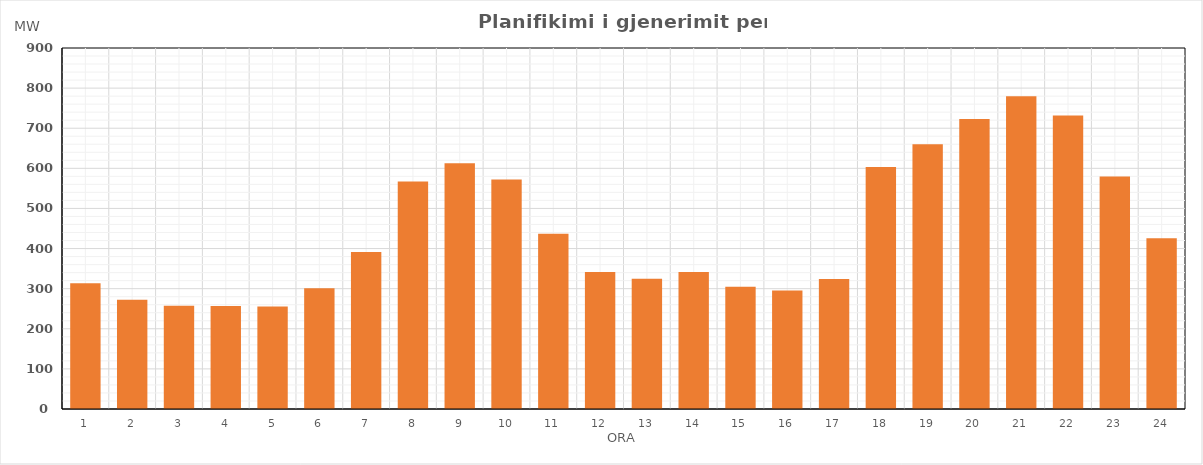
| Category | Max (MW) |
|---|---|
| 0 | 313.65 |
| 1 | 272.61 |
| 2 | 257.57 |
| 3 | 256.58 |
| 4 | 255.6 |
| 5 | 301.27 |
| 6 | 391.26 |
| 7 | 567.4 |
| 8 | 612.75 |
| 9 | 571.9 |
| 10 | 436.67 |
| 11 | 341.71 |
| 12 | 324.69 |
| 13 | 341.77 |
| 14 | 304.64 |
| 15 | 295.54 |
| 16 | 324.04 |
| 17 | 603.33 |
| 18 | 660.26 |
| 19 | 723.26 |
| 20 | 779.72 |
| 21 | 731.87 |
| 22 | 579.75 |
| 23 | 425.62 |